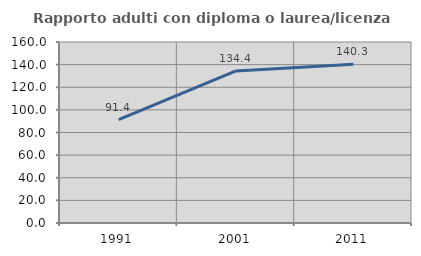
| Category | Rapporto adulti con diploma o laurea/licenza media  |
|---|---|
| 1991.0 | 91.379 |
| 2001.0 | 134.375 |
| 2011.0 | 140.278 |